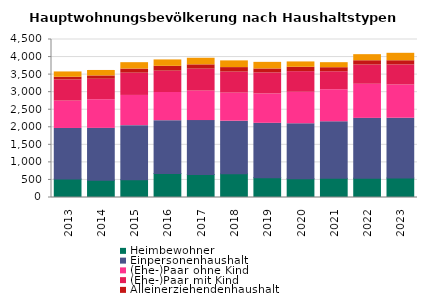
| Category | Heimbewohner | Einpersonenhaushalt | (Ehe-)Paar ohne Kind | (Ehe-)Paar mit Kind | Alleinerziehendenhaushalt | sonstiger Mehrpersonenhaushalt |
|---|---|---|---|---|---|---|
| 2013.0 | 524 | 1442 | 779 | 602 | 77 | 152 |
| 2014.0 | 494 | 1475 | 815 | 584 | 95 | 155 |
| 2015.0 | 506 | 1541 | 860 | 635 | 116 | 182 |
| 2016.0 | 683 | 1505 | 803 | 608 | 137 | 182 |
| 2017.0 | 656 | 1535 | 839 | 626 | 122 | 188 |
| 2018.0 | 674 | 1499 | 800 | 599 | 128 | 191 |
| 2019.0 | 566 | 1547 | 836 | 599 | 113 | 188 |
| 2020.0 | 533 | 1565 | 899 | 587 | 125 | 152 |
| 2021.0 | 545 | 1610 | 914 | 512 | 116 | 143 |
| 2022.0 | 551 | 1703 | 971 | 548 | 122 | 173 |
| 2023.0 | 554 | 1703 | 947 | 572 | 119 | 212 |